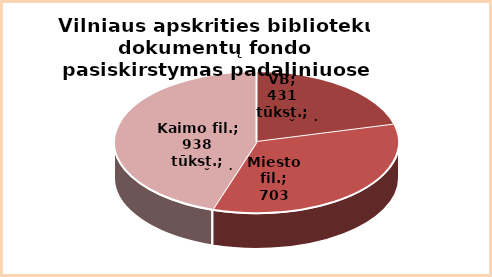
| Category | Series 0 |
|---|---|
| VB | 0.21 |
| MF | 0.34 |
| KM | 0.45 |